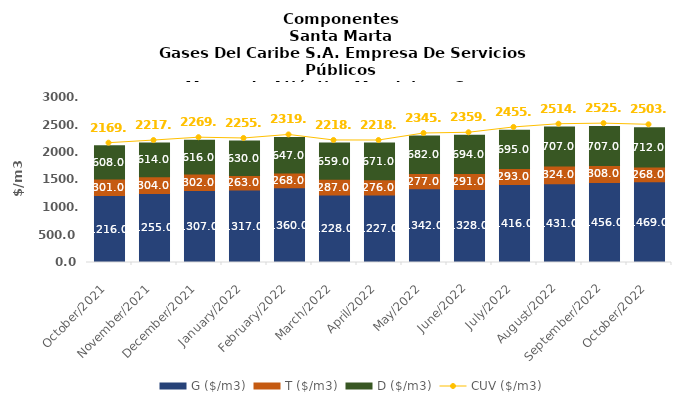
| Category | G ($/m3) | T ($/m3) | D ($/m3) |
|---|---|---|---|
| 2021-10-01 | 1216 | 301 | 608 |
| 2021-11-01 | 1255 | 304 | 614 |
| 2021-12-01 | 1307 | 302 | 616 |
| 2022-01-01 | 1317 | 263 | 630 |
| 2022-02-01 | 1360 | 268 | 647 |
| 2022-03-01 | 1228 | 287 | 659 |
| 2022-04-01 | 1227 | 276 | 671 |
| 2022-05-01 | 1342 | 277 | 682 |
| 2022-06-01 | 1328 | 291 | 694 |
| 2022-07-01 | 1416 | 293 | 695 |
| 2022-08-01 | 1431 | 324 | 707 |
| 2022-09-01 | 1456 | 308 | 707 |
| 2022-10-01 | 1469 | 268 | 712 |